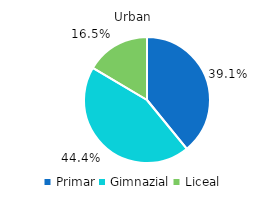
| Category | Series 0 |
|---|---|
| Primar | 39.1 |
| Gimnazial | 44.4 |
| Liceal | 16.5 |